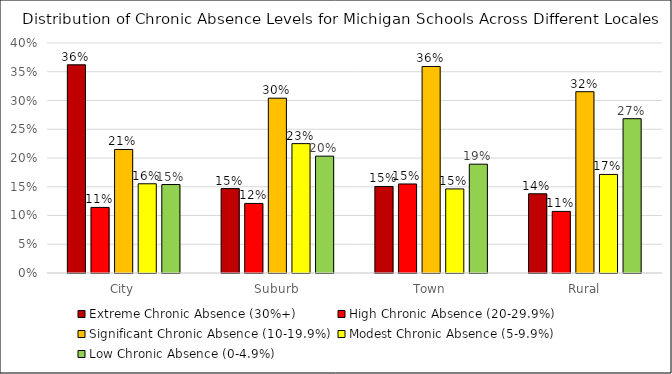
| Category | Extreme Chronic Absence (30%+) | High Chronic Absence (20-29.9%) | Significant Chronic Absence (10-19.9%) | Modest Chronic Absence (5-9.9%) | Low Chronic Absence (0-4.9%) |
|---|---|---|---|---|---|
| City | 0.362 | 0.114 | 0.215 | 0.155 | 0.154 |
| Suburb | 0.147 | 0.121 | 0.304 | 0.225 | 0.203 |
| Town | 0.151 | 0.155 | 0.359 | 0.146 | 0.189 |
| Rural | 0.138 | 0.107 | 0.315 | 0.171 | 0.268 |